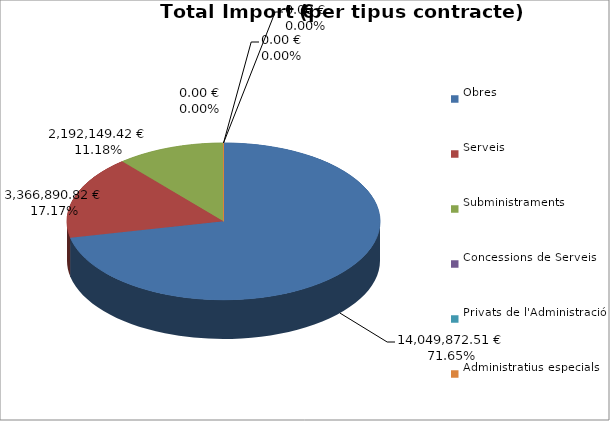
| Category | Total preu
(amb IVA) |
|---|---|
| Obres | 14049872.509 |
| Serveis | 3366890.824 |
| Subministraments | 2192149.416 |
| Concessions de Serveis | 0 |
| Privats de l'Administració | 0 |
| Administratius especials | 0 |